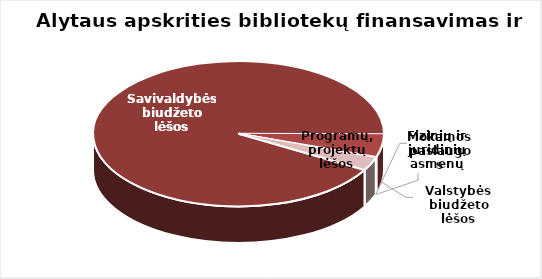
| Category | Series 0 |
|---|---|
| Savivaldybės biudžeto lėšos | 2807679.99 |
| Valstybės biudžeto lėšos | 156376 |
| Mokamos paslaugos | 6315.12 |
| Fizinių ir juridinių asmenų parama | 67.19 |
| Programų, projektų lėšos | 89473 |